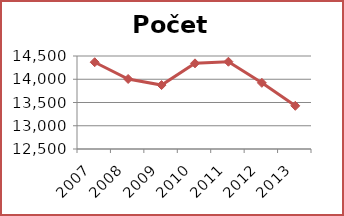
| Category | Počet čtenářů |
|---|---|
| 2007.0 | 14366 |
| 2008.0 | 14006 |
| 2009.0 | 13875 |
| 2010.0 | 14342 |
| 2011.0 | 14377 |
| 2012.0 | 13923 |
| 2013.0 | 13429 |